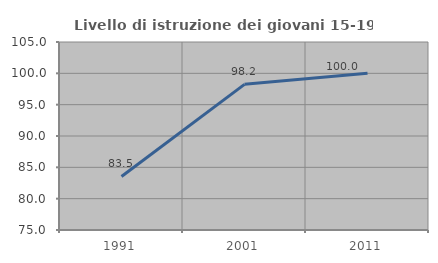
| Category | Livello di istruzione dei giovani 15-19 anni |
|---|---|
| 1991.0 | 83.544 |
| 2001.0 | 98.246 |
| 2011.0 | 100 |